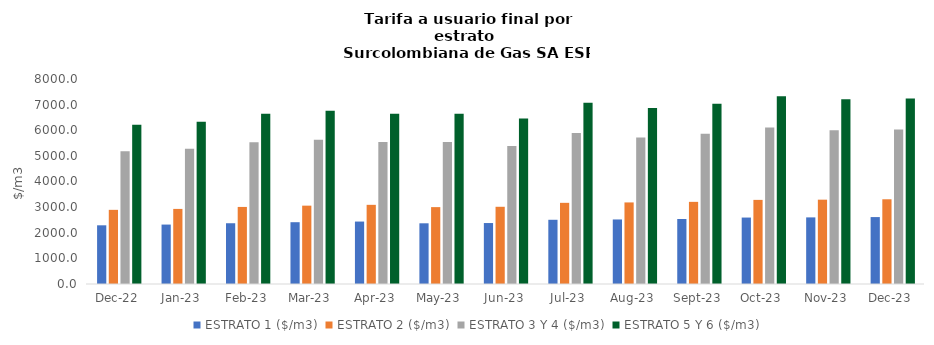
| Category | ESTRATO 1 ($/m3) | ESTRATO 2 ($/m3) | ESTRATO 3 Y 4 ($/m3) | ESTRATO 5 Y 6 ($/m3) |
|---|---|---|---|---|
| 2022-12-01 | 2290.39 | 2893.78 | 5177.58 | 6213.096 |
| 2023-01-01 | 2319.28 | 2930.28 | 5279.8 | 6335.76 |
| 2023-02-01 | 2371.01 | 3007.35 | 5533.45 | 6640.14 |
| 2023-03-01 | 2411.54 | 3057.29 | 5630.28 | 6756.336 |
| 2023-04-01 | 2436.88 | 3089.41 | 5539.66 | 6647.592 |
| 2023-05-01 | 2368.72 | 3000.27 | 5539.66 | 6647.592 |
| 2023-06-01 | 2379.07 | 3013.38 | 5382.53 | 6459.036 |
| 2023-07-01 | 2506.06 | 3167.43 | 5894.36 | 7073.232 |
| 2023-08-01 | 2518.61 | 3183.29 | 5720.38 | 6864.456 |
| 2023-09-01 | 2536.22 | 3205.55 | 5864.55 | 7037.46 |
| 2023-10-01 | 2592.91 | 3282.61 | 6107.41 | 7328.892 |
| 2023-11-01 | 2599.39 | 3290.81 | 6004.48 | 7205.376 |
| 2023-12-01 | 2611.58 | 3306.24 | 6032.48 | 7238.976 |